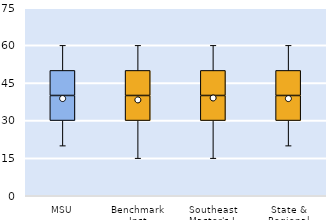
| Category | 25th | 50th | 75th |
|---|---|---|---|
| MSU | 30 | 10 | 10 |
| Benchmark Inst | 30 | 10 | 10 |
| Southeast Master's-L | 30 | 10 | 10 |
| State & Regional | 30 | 10 | 10 |